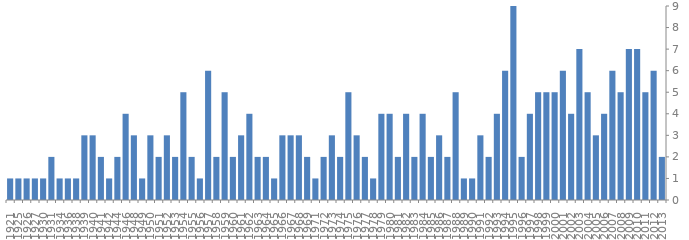
| Category | Series 0 |
|---|---|
| 2013.0 | 2 |
| 2012.0 | 6 |
| 2011.0 | 5 |
| 2010.0 | 7 |
| 2009.0 | 7 |
| 2008.0 | 5 |
| 2007.0 | 6 |
| 2006.0 | 4 |
| 2005.0 | 3 |
| 2004.0 | 5 |
| 2003.0 | 7 |
| 2002.0 | 4 |
| 2001.0 | 6 |
| 2000.0 | 5 |
| 1999.0 | 5 |
| 1998.0 | 5 |
| 1997.0 | 4 |
| 1996.0 | 2 |
| 1995.0 | 9 |
| 1994.0 | 6 |
| 1993.0 | 4 |
| 1992.0 | 2 |
| 1991.0 | 3 |
| 1990.0 | 1 |
| 1989.0 | 1 |
| 1988.0 | 5 |
| 1987.0 | 2 |
| 1986.0 | 3 |
| 1985.0 | 2 |
| 1984.0 | 4 |
| 1983.0 | 2 |
| 1982.0 | 4 |
| 1981.0 | 2 |
| 1980.0 | 4 |
| 1979.0 | 4 |
| 1978.0 | 1 |
| 1977.0 | 2 |
| 1976.0 | 3 |
| 1975.0 | 5 |
| 1974.0 | 2 |
| 1973.0 | 3 |
| 1972.0 | 2 |
| 1971.0 | 1 |
| 1969.0 | 2 |
| 1968.0 | 3 |
| 1967.0 | 3 |
| 1966.0 | 3 |
| 1965.0 | 1 |
| 1964.0 | 2 |
| 1963.0 | 2 |
| 1962.0 | 4 |
| 1961.0 | 3 |
| 1960.0 | 2 |
| 1959.0 | 5 |
| 1958.0 | 2 |
| 1957.0 | 6 |
| 1956.0 | 1 |
| 1955.0 | 2 |
| 1954.0 | 5 |
| 1953.0 | 2 |
| 1952.0 | 3 |
| 1951.0 | 2 |
| 1950.0 | 3 |
| 1949.0 | 1 |
| 1948.0 | 3 |
| 1946.0 | 4 |
| 1944.0 | 2 |
| 1942.0 | 1 |
| 1941.0 | 2 |
| 1940.0 | 3 |
| 1939.0 | 3 |
| 1938.0 | 1 |
| 1936.0 | 1 |
| 1934.0 | 1 |
| 1931.0 | 2 |
| 1930.0 | 1 |
| 1927.0 | 1 |
| 1926.0 | 1 |
| 1925.0 | 1 |
| 1921.0 | 1 |